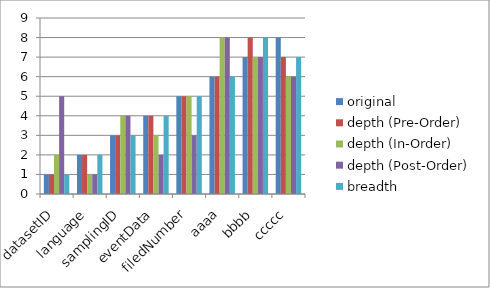
| Category | original | depth (Pre-Order) | depth (In-Order) | depth (Post-Order) | breadth |
|---|---|---|---|---|---|
| datasetID | 1 | 1 | 2 | 5 | 1 |
| language | 2 | 2 | 1 | 1 | 2 |
| samplingID | 3 | 3 | 4 | 4 | 3 |
| eventData | 4 | 4 | 3 | 2 | 4 |
| filedNumber | 5 | 5 | 5 | 3 | 5 |
| aaaa | 6 | 6 | 8 | 8 | 6 |
| bbbb | 7 | 8 | 7 | 7 | 8 |
| ccccc | 8 | 7 | 6 | 6 | 7 |